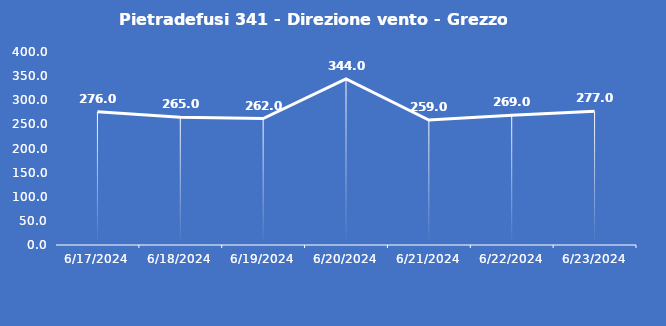
| Category | Pietradefusi 341 - Direzione vento - Grezzo (°N) |
|---|---|
| 6/17/24 | 276 |
| 6/18/24 | 265 |
| 6/19/24 | 262 |
| 6/20/24 | 344 |
| 6/21/24 | 259 |
| 6/22/24 | 269 |
| 6/23/24 | 277 |